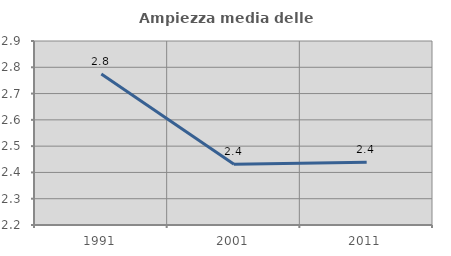
| Category | Ampiezza media delle famiglie |
|---|---|
| 1991.0 | 2.774 |
| 2001.0 | 2.431 |
| 2011.0 | 2.439 |